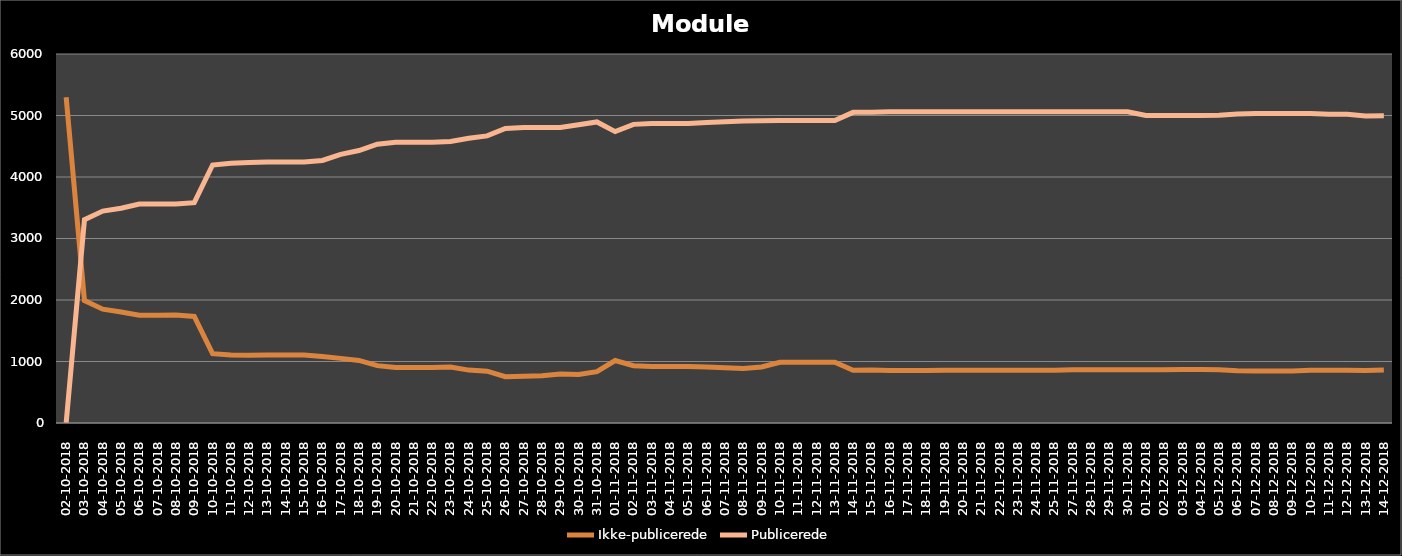
| Category | Ikke-publicerede | Publicerede |
|---|---|---|
| 02-10-2018 | 5297 | 0 |
| 03-10-2018 | 1991 | 3306 |
| 04-10-2018 | 1851 | 3446 |
| 05-10-2018 | 1805 | 3492 |
| 06-10-2018 | 1751 | 3561 |
| 07-10-2018 | 1751 | 3561 |
| 08-10-2018 | 1755 | 3561 |
| 09-10-2018 | 1733 | 3583 |
| 10-10-2018 | 1127 | 4195 |
| 11-10-2018 | 1106 | 4222 |
| 12-10-2018 | 1100 | 4237 |
| 13-10-2018 | 1104 | 4243 |
| 14-10-2018 | 1104 | 4243 |
| 15-10-2018 | 1104 | 4243 |
| 16-10-2018 | 1082 | 4269 |
| 17-10-2018 | 1051 | 4368 |
| 18-10-2018 | 1017 | 4430 |
| 19-10-2018 | 933 | 4533 |
| 20-10-2018 | 902 | 4564 |
| 21-10-2018 | 902 | 4564 |
| 22-10-2018 | 902 | 4564 |
| 23-10-2018 | 911 | 4579 |
| 24-10-2018 | 860 | 4630 |
| 25-10-2018 | 842 | 4669 |
| 26-10-2018 | 752 | 4788 |
| 27-10-2018 | 761 | 4806 |
| 28-10-2018 | 768 | 4806 |
| 29-10-2018 | 797 | 4806 |
| 30-10-2018 | 789 | 4851 |
| 31-10-2018 | 835 | 4895 |
| 01-11-2018 | 1016 | 4738 |
| 02-11-2018 | 931 | 4856 |
| 03-11-2018 | 920 | 4868 |
| 04-11-2018 | 920 | 4868 |
| 05-11-2018 | 920 | 4868 |
| 06-11-2018 | 911 | 4885 |
| 07-11-2018 | 897 | 4899 |
| 08-11-2018 | 886 | 4910 |
| 09-11-2018 | 911 | 4913 |
| 10-11-2018 | 988 | 4919 |
| 11-11-2018 | 988 | 4919 |
| 12-11-2018 | 989 | 4919 |
| 13-11-2018 | 989 | 4919 |
| 14-11-2018 | 857 | 5051 |
| 15-11-2018 | 860 | 5051 |
| 16-11-2018 | 854 | 5060 |
| 17-11-2018 | 854 | 5060 |
| 18-11-2018 | 854 | 5060 |
| 19-11-2018 | 858 | 5060 |
| 20-11-2018 | 858 | 5060 |
| 21-11-2018 | 856 | 5062 |
| 22-11-2018 | 856 | 5062 |
| 23-11-2018 | 856 | 5062 |
| 24-11-2018 | 857 | 5062 |
| 25-11-2018 | 857 | 5062 |
| 27-11-2018 | 864 | 5062 |
| 28-11-2018 | 864 | 5062 |
| 29-11-2018 | 864 | 5062 |
| 30-11-2018 | 864 | 5062 |
| 01-12-2018 | 867 | 5001 |
| 02-12-2018 | 867 | 5001 |
| 03-12-2018 | 869 | 5001 |
| 04-12-2018 | 869 | 5002 |
| 05-12-2018 | 866 | 5005 |
| 06-12-2018 | 849 | 5026 |
| 07-12-2018 | 846 | 5034 |
| 08-12-2018 | 847 | 5034 |
| 09-12-2018 | 847 | 5034 |
| 10-12-2018 | 857 | 5034 |
| 11-12-2018 | 856 | 5019 |
| 12-12-2018 | 856 | 5021 |
| 13-12-2018 | 853 | 4993 |
| 14-12-2018 | 860 | 4995 |